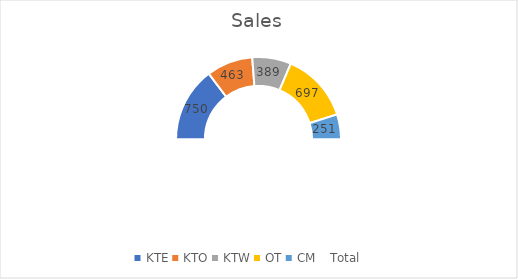
| Category | Sales |
|---|---|
| KTE | 750 |
| KTO | 463 |
| KTW | 389 |
| OT | 697 |
| CM | 251 |
| Total | 2550 |